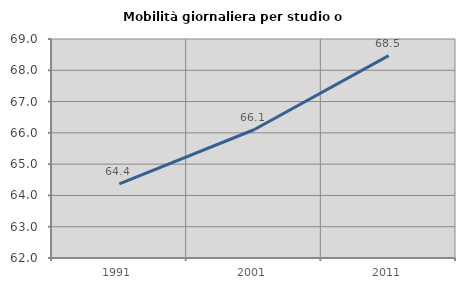
| Category | Mobilità giornaliera per studio o lavoro |
|---|---|
| 1991.0 | 64.368 |
| 2001.0 | 66.099 |
| 2011.0 | 68.467 |